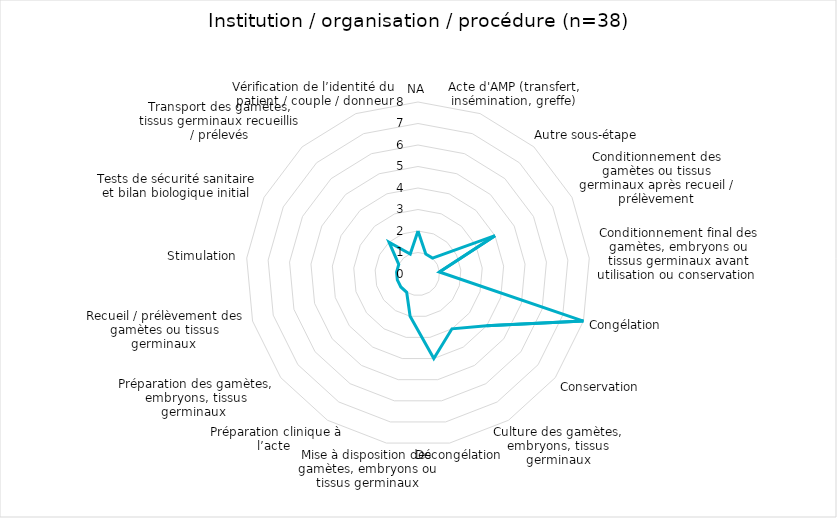
| Category | Series 0 |
|---|---|
| NA | 2 |
| Acte d'AMP (transfert, insémination, greffe) | 1 |
| Autre sous-étape  | 1 |
| Conditionnement des gamètes ou tissus germinaux après recueil / prélèvement | 4 |
| Conditionnement final des gamètes, embryons ou tissus germinaux avant utilisation ou conservation  | 1 |
| Congélation | 8 |
| Conservation | 4 |
| Culture des gamètes, embryons, tissus germinaux | 3 |
| Décongélation | 4 |
| Mise à disposition des gamètes, embryons ou tissus germinaux | 2 |
| Préparation clinique à l’acte  | 1 |
| Préparation des gamètes, embryons, tissus germinaux  | 1 |
| Recueil / prélèvement des gamètes ou tissus germinaux  | 1 |
| Stimulation | 1 |
| Tests de sécurité sanitaire et bilan biologique initial | 1 |
| Transport des gamètes, tissus germinaux recueillis / prélevés | 2 |
| Vérification de l’identité du patient / couple / donneur | 1 |